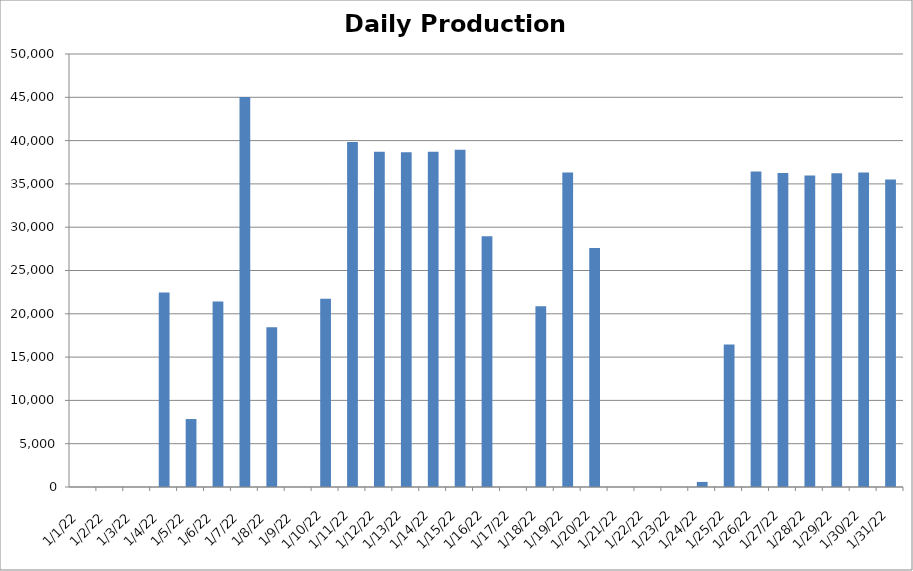
| Category | Cogen Daily Production (kWh) |
|---|---|
| 1/1/22 | 0 |
| 1/2/22 | 0 |
| 1/3/22 | 0 |
| 1/4/22 | 22452 |
| 1/5/22 | 7847 |
| 1/6/22 | 21420.25 |
| 1/7/22 | 45023.5 |
| 1/8/22 | 18451.5 |
| 1/9/22 | 0 |
| 1/10/22 | 21738.5 |
| 1/11/22 | 39841.5 |
| 1/12/22 | 38708.25 |
| 1/13/22 | 38660.5 |
| 1/14/22 | 38707.25 |
| 1/15/22 | 38932.5 |
| 1/16/22 | 28960 |
| 1/17/22 | 0 |
| 1/18/22 | 20885 |
| 1/19/22 | 36314.25 |
| 1/20/22 | 27603.5 |
| 1/21/22 | 0 |
| 1/22/22 | 0 |
| 1/23/22 | 0 |
| 1/24/22 | 587 |
| 1/25/22 | 16466.25 |
| 1/26/22 | 36424.5 |
| 1/27/22 | 36258.75 |
| 1/28/22 | 35982 |
| 1/29/22 | 36224 |
| 1/30/22 | 36307.5 |
| 1/31/22 | 35516 |